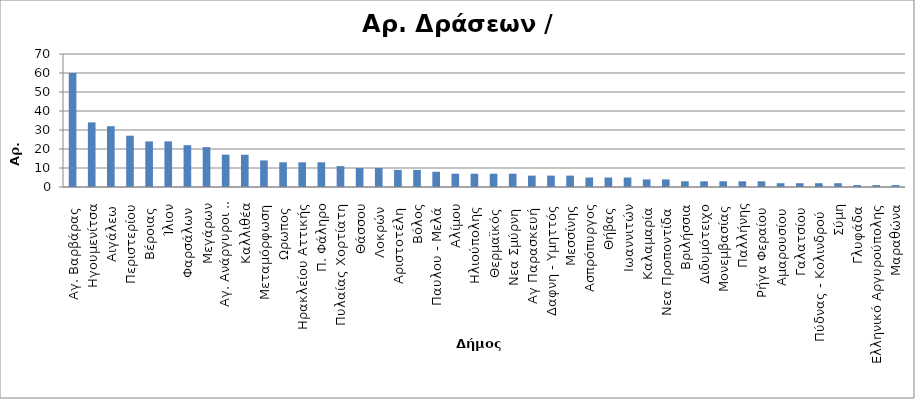
| Category | Series 0 |
|---|---|
| Αγ. Βαρβάρας  | 60 |
| Ηγουμενίτσα | 34 |
| Αιγάλεω  | 32 |
| Περιστερίου | 27 |
| Βέροιας  | 24 |
| Ίλιον | 24 |
| Φαρσάλων  | 22 |
| Μεγάρων | 21 |
| Αγ. Ανάργυροι - Καματερό  | 17 |
| Καλλιθέα | 17 |
| Μεταμόρφωση | 14 |
| Ωρωπος  | 13 |
| Ηρακλείου Αττικής | 13 |
| Π. Φάληρο | 13 |
| Πυλαίας Χορτίατη | 11 |
| Θάσσου | 10 |
| Λοκρών  | 10 |
| Αριστοτέλη  | 9 |
| Βόλος | 9 |
| Παυλου - Μελά  | 8 |
| Αλίμου | 7 |
| Ηλιούπολης  | 7 |
| Θερμαϊκός  | 7 |
| Νεα Σμύρνη  | 7 |
| Αγ Παρασκευή  | 6 |
| Δαφνη - Υμηττός | 6 |
| Μεσσίνης | 6 |
| Ασπρόπυργος | 5 |
| Θήβας  | 5 |
| Ιωαννιτών | 5 |
| Καλαμαρία  | 4 |
| Νεα Προποντίδα  | 4 |
| Βριλήσσια | 3 |
| Διδυμότειχο | 3 |
| Μονεμβασίας | 3 |
| Παλλήνης | 3 |
| Ρήγα Φεραίου  | 3 |
| Αμαρουσίου  | 2 |
| Γαλατσίου  | 2 |
| Πύδνας - Κολινδρού   | 2 |
| Σύμη | 2 |
| Γλυφάδα  | 1 |
| Ελληνικό Αργυρούπολης | 1 |
| Μαραθώνα | 1 |